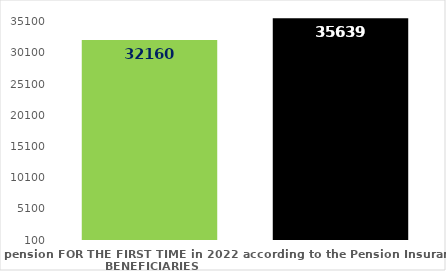
| Category | broj korisnika |
|---|---|
| Pension beneficiaries entitled to pension FOR THE FIRST TIME in 2022 according to the Pension Insurance Act  - NEW BENEFICIARIES | 32160 |
| Pension beneficiaries whose pension entitlement ceased in 2022  -  death caused,   
and who were retired according to the Pension Insurance Act   | 35639 |